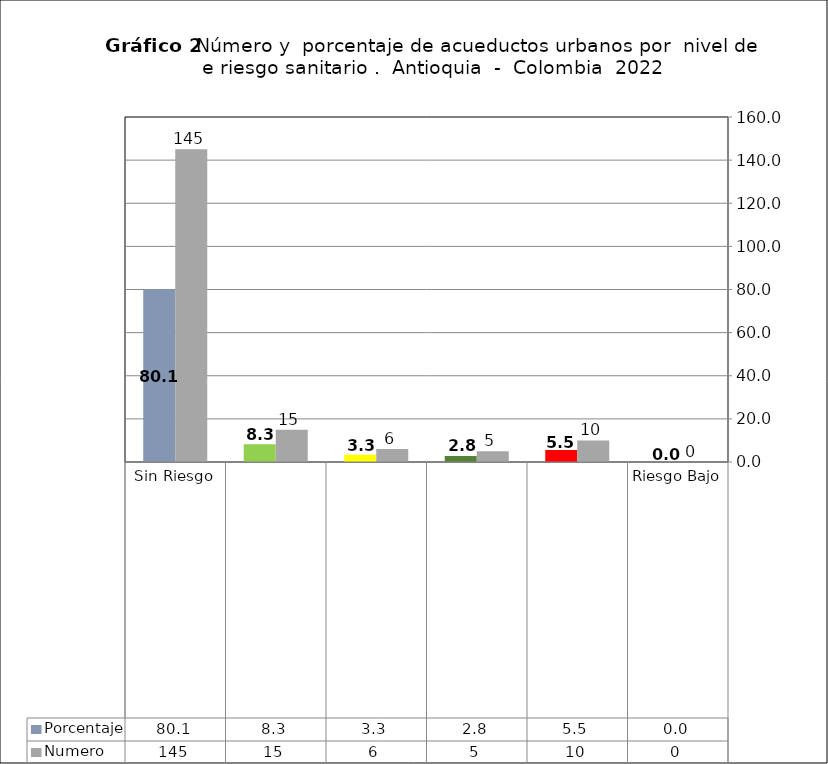
| Category | Porcentaje | Numero |
|---|---|---|
| Sin Riesgo | 80.11 | 145 |
| Riesgo Bajo | 8.287 | 15 |
| Riesgo Medio | 3.315 | 6 |
| Riesgo Alto | 2.762 | 5 |
| Inviable Sanitariamente | 5.525 | 10 |
| Sin Dato | 0 | 0 |